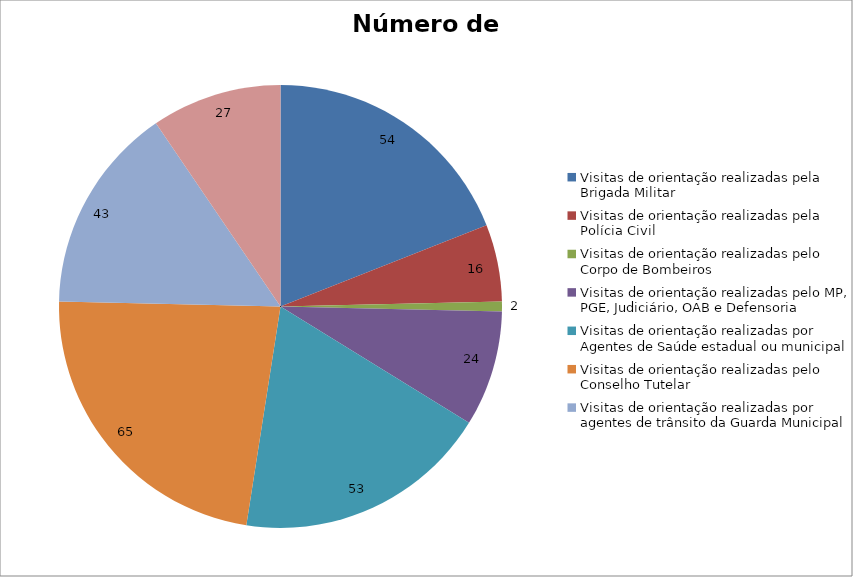
| Category | Número de Ações |
|---|---|
| Visitas de orientação realizadas pela Brigada Militar | 54 |
| Visitas de orientação realizadas pela Polícia Civil | 16 |
| Visitas de orientação realizadas pelo Corpo de Bombeiros | 2 |
| Visitas de orientação realizadas pelo MP, PGE, Judiciário, OAB e Defensoria | 24 |
| Visitas de orientação realizadas por Agentes de Saúde estadual ou municipal | 53 |
| Visitas de orientação realizadas pelo Conselho Tutelar | 65 |
| Visitas de orientação realizadas por agentes de trânsito da Guarda Municipal | 43 |
| Visitas de orientação realizadas por ONGs, entidades privadas, CRAS e CREAS | 27 |